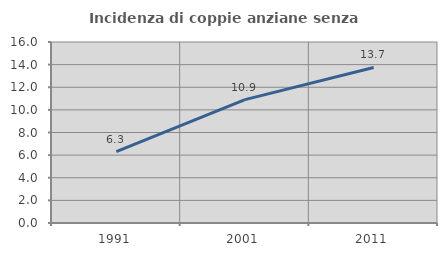
| Category | Incidenza di coppie anziane senza figli  |
|---|---|
| 1991.0 | 6.301 |
| 2001.0 | 10.909 |
| 2011.0 | 13.747 |